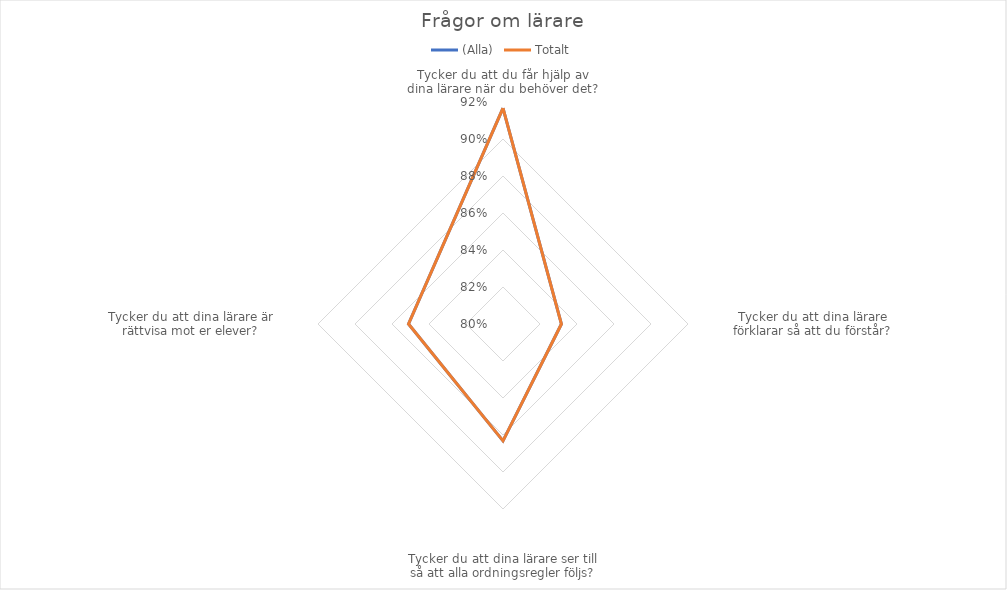
| Category | (Alla) | Totalt |
|---|---|---|
| Tycker du att du får hjälp av dina lärare när du behöver det? | 0.917 | 0.917 |
| Tycker du att dina lärare förklarar så att du förstår? | 0.832 | 0.832 |
| Tycker du att dina lärare ser till så att alla ordningsregler följs? | 0.863 | 0.863 |
| Tycker du att dina lärare är rättvisa mot er elever? | 0.851 | 0.851 |